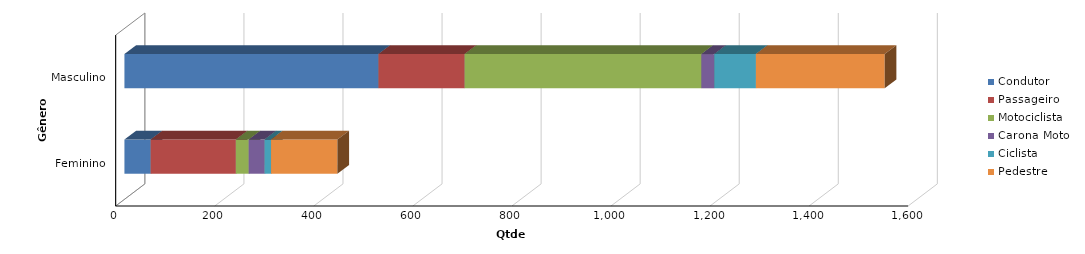
| Category | Condutor | Passageiro | Motociclista | Carona Moto | Ciclista | Pedestre |
|---|---|---|---|---|---|---|
| Feminino | 53 | 172 | 26 | 32 | 13 | 134 |
| Masculino | 513 | 174 | 478 | 26 | 84 | 260 |